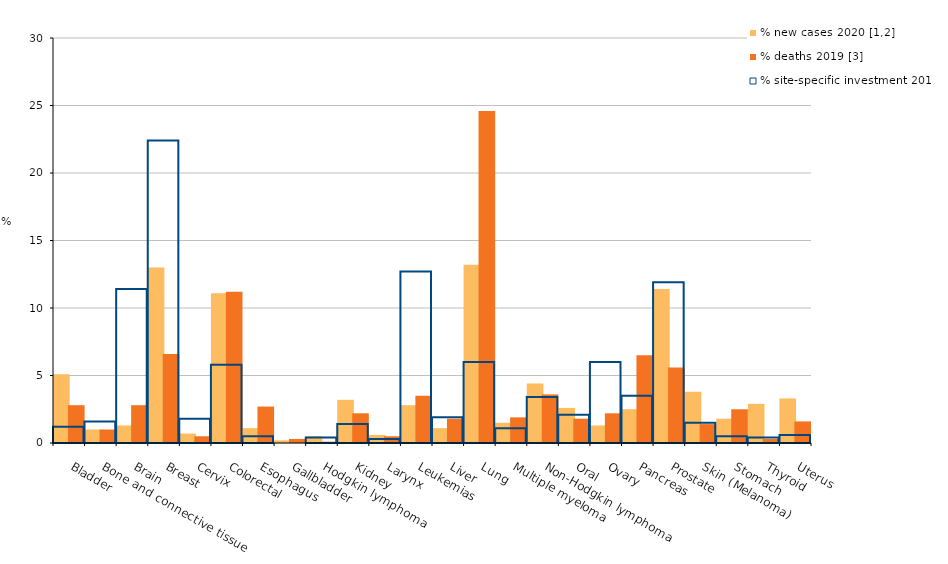
| Category | % new cases 2020 [1,2] | % deaths 2019 [3] |
|---|---|---|
| Bladder | 5.1 | 2.8 |
| Bone and connective tissue | 1 | 1 |
| Brain | 1.3 | 2.8 |
| Breast | 13 | 6.6 |
| Cervix | 0.7 | 0.5 |
| Colorectal | 11.1 | 11.2 |
| Esophagus | 1.1 | 2.7 |
| Gallbladder | 0.2 | 0.3 |
| Hodgkin lymphoma | 0.5 | 0.1 |
| Kidney | 3.2 | 2.2 |
| Larynx | 0.6 | 0.5 |
| Leukemias | 2.8 | 3.5 |
| Liver | 1.1 | 1.8 |
| Lung | 13.2 | 24.6 |
| Multiple myeloma | 1.5 | 1.9 |
| Non-Hodgkin lymphoma | 4.4 | 3.6 |
| Oral | 2.6 | 1.8 |
| Ovary | 1.3 | 2.2 |
| Pancreas | 2.5 | 6.5 |
| Prostate | 11.4 | 5.6 |
| Skin (Melanoma) | 3.8 | 1.4 |
| Stomach | 1.8 | 2.5 |
| Thyroid | 2.9 | 0.3 |
| Uterus | 3.3 | 1.6 |